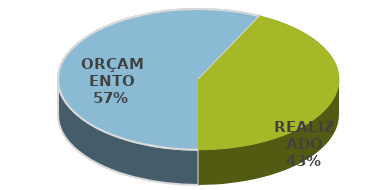
| Category | Series 0 |
|---|---|
| ORÇAMENTO | 1085000 |
| REALIZADO | 812000 |